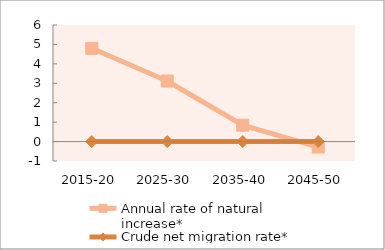
| Category | Annual rate of natural increase* | Crude net migration rate* |
|---|---|---|
| 2015-20 | 4.8 | 0 |
| 2025-30 | 3.116 | 0 |
| 2035-40 | 0.842 | 0 |
| 2045-50 | -0.281 | 0 |